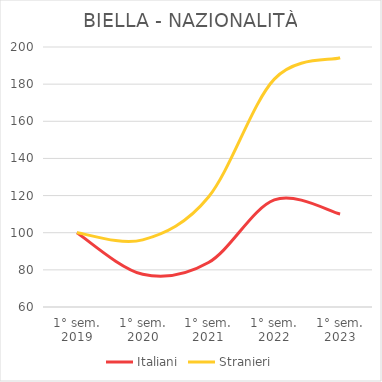
| Category | Italiani | Stranieri |
|---|---|---|
| 1° sem.
2019 | 100 | 100 |
| 1° sem.
2020 | 77.602 | 96.154 |
| 1° sem.
2021 | 83.937 | 119.231 |
| 1° sem.
2022 | 117.647 | 182.692 |
| 1° sem.
2023 | 110.068 | 194.231 |